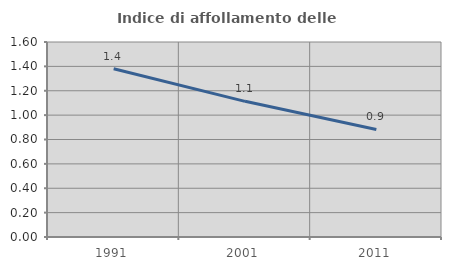
| Category | Indice di affollamento delle abitazioni  |
|---|---|
| 1991.0 | 1.381 |
| 2001.0 | 1.113 |
| 2011.0 | 0.883 |